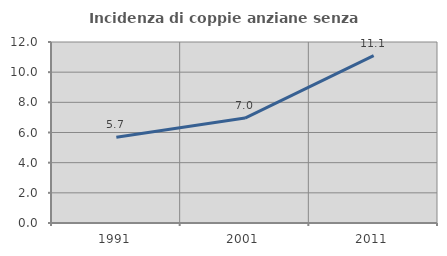
| Category | Incidenza di coppie anziane senza figli  |
|---|---|
| 1991.0 | 5.691 |
| 2001.0 | 6.957 |
| 2011.0 | 11.097 |